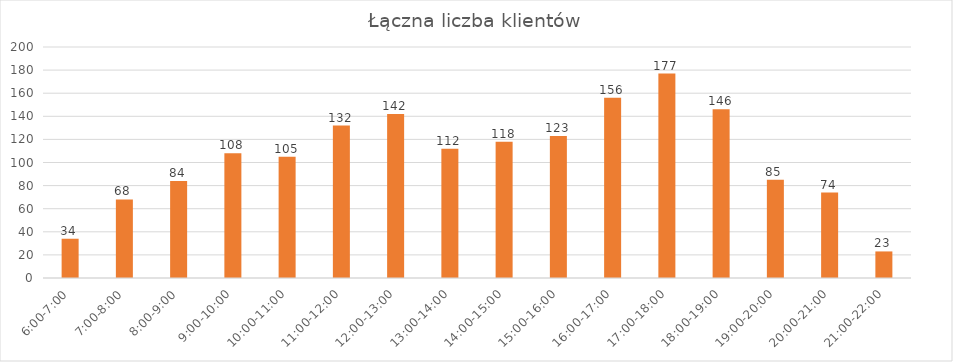
| Category | Wchodzący |
|---|---|
| 6:00-7:00 | 34 |
| 7:00-8:00 | 68 |
| 8:00-9:00 | 84 |
| 9:00-10:00 | 108 |
| 10:00-11:00 | 105 |
| 11:00-12:00 | 132 |
| 12:00-13:00 | 142 |
| 13:00-14:00 | 112 |
| 14:00-15:00 | 118 |
| 15:00-16:00 | 123 |
| 16:00-17:00 | 156 |
| 17:00-18:00 | 177 |
| 18:00-19:00 | 146 |
| 19:00-20:00 | 85 |
| 20:00-21:00 | 74 |
| 21:00-22:00 | 23 |